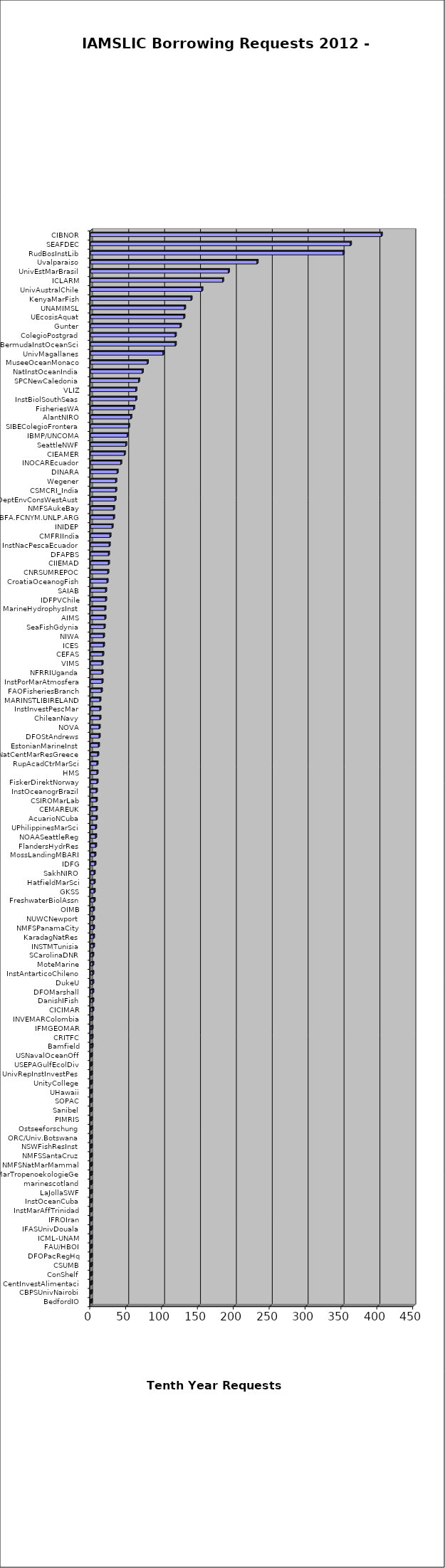
| Category | Series 0 |
|---|---|
| BedfordIO  | 1 |
| CBPSUnivNairobi  | 1 |
| CentInvestAlimentaci  | 1 |
| ConShelf  | 1 |
| CSUMB  | 1 |
| DFOPacRegHq  | 1 |
| FAU/HBOI  | 1 |
| ICML-UNAM  | 1 |
| IFASUnivDouala  | 1 |
| IFROIran  | 1 |
| InstMarAffTrinidad  | 1 |
| InstOceanCuba  | 1 |
| LaJollaSWF  | 1 |
| marinescotland  | 1 |
| MarTropenoekologieGe  | 1 |
| NMFSNatMarMammal  | 1 |
| NMFSSantaCruz  | 1 |
| NSWFishResInst  | 1 |
| ORC/Univ.Botswana  | 1 |
| Ostseeforschung  | 1 |
| PIMRIS  | 1 |
| Sanibel  | 1 |
| SOPAC  | 1 |
| UHawaii  | 1 |
| UnityCollege  | 1 |
| UnivRepInstInvestPes  | 1 |
| USEPAGulfEcolDiv  | 1 |
| USNavalOceanOff  | 1 |
| Bamfield  | 2 |
| CRITFC  | 2 |
| IFMGEOMAR  | 2 |
| INVEMARColombia  | 2 |
| CICIMAR  | 3 |
| DanishIFish  | 3 |
| DFOMarshall  | 3 |
| DukeU  | 3 |
| InstAntarticoChileno  | 3 |
| MoteMarine  | 3 |
| SCarolinaDNR  | 3 |
| INSTMTunisia  | 4 |
| KaradagNatRes  | 4 |
| NMFSPanamaCity  | 4 |
| NUWCNewport  | 4 |
| OIMB  | 4 |
| FreshwaterBiolAssn  | 5 |
| GKSS  | 5 |
| HatfieldMarSci  | 5 |
| SakhNIRO  | 5 |
| IDFG  | 6 |
| MossLandingMBARI  | 6 |
| FlandersHydrRes  | 7 |
| NOAASeattleReg  | 7 |
| UPhilippinesMarSci  | 7 |
| AcuarioNCuba  | 8 |
| CEMAREUK  | 8 |
| CSIROMarLab  | 8 |
| InstOceanogrBrazil  | 8 |
| FiskerDirektNorway  | 9 |
| HMS  | 9 |
| RupAcadCtrMarSci  | 9 |
| NatCentMarResGreece  | 10 |
| EstonianMarineInst  | 11 |
| DFOStAndrews  | 12 |
| NOVA  | 12 |
| ChileanNavy  | 13 |
| InstInvestPescMar  | 13 |
| MARINSTLIBIRELAND  | 13 |
| FAOFisheriesBranch  | 15 |
| InstPorMarAtmosfera  | 16 |
| NFRRIUganda  | 16 |
| VIMS  | 16 |
| CEFAS  | 17 |
| ICES  | 18 |
| NIWA  | 18 |
| SeaFishGdynia  | 19 |
| AIMS  | 20 |
| MarineHydrophysInst  | 20 |
| IDFPVChile  | 21 |
| SAIAB  | 21 |
| CroatiaOceanogFish  | 23 |
| CNRSUMREPOC  | 24 |
| CIIEMAD  | 25 |
| DFAPBS  | 25 |
| InstNacPescaEcuador  | 26 |
| CMFRIIndia  | 27 |
| INIDEP  | 30 |
| BFA.FCNYM.UNLP.ARG  | 32 |
| NMFSAukeBay  | 32 |
| DeptEnvConsWestAust  | 34 |
| CSMCRI_India  | 35 |
| Wegener  | 35 |
| DINARA  | 37 |
| INOCAREcuador  | 42 |
| CIEAMER  | 47 |
| SeattleNWF  | 49 |
| IBMP/UNCOMA  | 51 |
| SIBEColegioFrontera  | 53 |
| AlantNIRO  | 56 |
| FisheriesWA  | 60 |
| InstBiolSouthSeas  | 63 |
| VLIZ  | 63 |
| SPCNewCaledonia  | 67 |
| NatInstOceanIndia  | 72 |
| MuseeOceanMonaco  | 79 |
| UnivMagallanes  | 101 |
| BermudaInstOceanSci  | 118 |
| ColegioPostgrad  | 118 |
| Gunter  | 125 |
| UEcosisAquat  | 130 |
| UNAMIMSL  | 131 |
| KenyaMarFish  | 140 |
| UnivAustralChile  | 155 |
| ICLARM  | 184 |
| UnivEstMarBrasil  | 192 |
| Uvalparaiso  | 232 |
| RudBosInstLib  | 352 |
| SEAFDEC  | 362 |
| CIBNOR  | 405 |